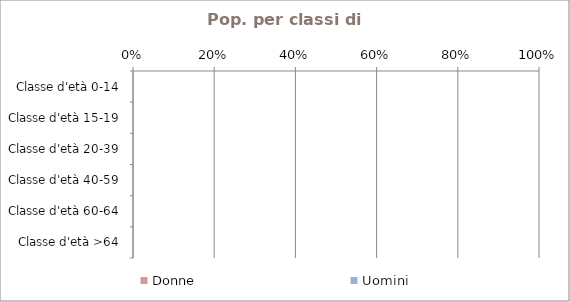
| Category | Donne | Uomini |
|---|---|---|
| Classe d'età 0-14 | 0 | 0 |
| Classe d'età 15-19 | 0 | 0 |
| Classe d'età 20-39 | 0 | 0 |
| Classe d'età 40-59 | 0 | 0 |
| Classe d'età 60-64 | 0 | 0 |
| Classe d'età >64 | 0 | 0 |